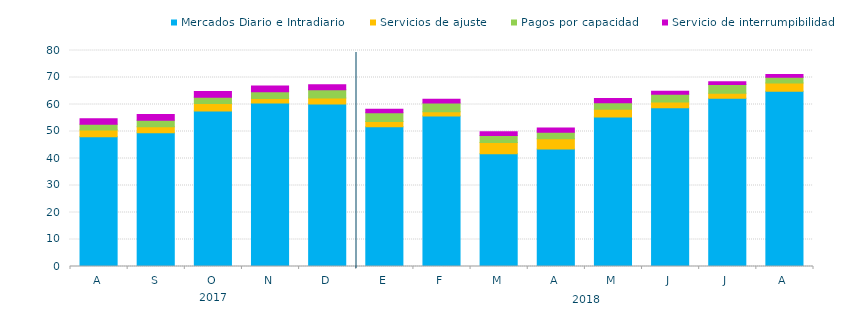
| Category | Mercados Diario e Intradiario  | Servicios de ajuste | Pagos por capacidad | Servicio de interrumpibilidad |
|---|---|---|---|---|
| A | 48.03 | 2.49 | 2.18 | 1.99 |
| S | 49.52 | 2.2 | 2.42 | 2.14 |
| O | 57.56 | 2.77 | 2.35 | 2.15 |
| N | 60.56 | 1.69 | 2.5 | 2.07 |
| D | 60.14 | 2.25 | 3.08 | 1.85 |
| E | 51.77 | 1.96 | 3.19 | 1.36 |
| F | 55.76 | 1.57 | 3.18 | 1.44 |
| M | 41.75 | 4.2 | 2.55 | 1.39 |
| A | 43.53 | 3.79 | 2.41 | 1.54 |
| M | 55.4 | 2.88 | 2.37 | 1.53 |
| J | 58.82 | 2.1 | 2.85 | 1.13 |
| J | 62.3 | 1.83 | 3.3 | 1.04 |
| A | 64.95 | 2.97 | 2.19 | 1.04 |